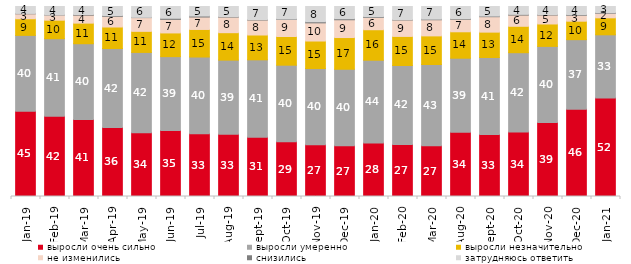
| Category | выросли очень сильно | выросли умеренно | выросли незначительно | не изменились | снизились | затрудняюсь ответить |
|---|---|---|---|---|---|---|
| 2019-01-01 | 44.85 | 39.95 | 8.75 | 2.6 | 0.2 | 3.65 |
| 2019-02-01 | 42.2 | 40.85 | 9.75 | 2.7 | 0.1 | 4.4 |
| 2019-03-01 | 40.527 | 39.881 | 10.84 | 4.177 | 0.348 | 4.227 |
| 2019-04-01 | 36.337 | 41.535 | 11.337 | 5.594 | 0.396 | 4.802 |
| 2019-05-01 | 33.531 | 42.298 | 11.095 | 7.231 | 0.149 | 5.696 |
| 2019-06-01 | 34.763 | 38.853 | 12.469 | 7.132 | 0.599 | 6.185 |
| 2019-07-01 | 32.97 | 40.446 | 14.505 | 6.535 | 0.545 | 5 |
| 2019-08-01 | 32.767 | 39.011 | 14.436 | 8.192 | 0.25 | 5.345 |
| 2019-09-01 | 31.188 | 40.743 | 13.069 | 7.871 | 0.248 | 6.881 |
| 2019-10-01 | 28.762 | 40.347 | 15.099 | 8.96 | 0.248 | 6.584 |
| 2019-11-01 | 27.178 | 40.149 | 14.505 | 9.554 | 0.594 | 8.02 |
| 2019-12-01 | 26.683 | 40.297 | 16.683 | 9.356 | 0.545 | 6.436 |
| 2020-01-01 | 28.218 | 43.515 | 16.04 | 6.436 | 0.396 | 5.396 |
| 2020-02-01 | 27.426 | 41.535 | 15.297 | 8.614 | 0.198 | 6.931 |
| 2020-03-01 | 26.673 | 42.786 | 15.072 | 8.478 | 0.347 | 6.644 |
| 2020-08-01 | 33.813 | 38.977 | 13.903 | 6.554 | 0.348 | 6.405 |
| 2020-09-01 | 32.603 | 40.567 | 13.34 | 8.113 | 0.348 | 5.027 |
| 2020-10-01 | 33.981 | 41.704 | 13.901 | 5.879 | 0.399 | 4.136 |
| 2020-11-01 | 39 | 40 | 11.8 | 4.7 | 0.25 | 4.25 |
| 2020-12-01 | 45.86 | 36.688 | 9.717 | 3.074 | 0.347 | 4.313 |
| 2021-01-01 | 51.863 | 33.234 | 8.942 | 2.385 | 0.298 | 3.279 |